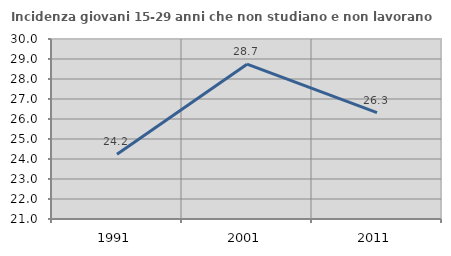
| Category | Incidenza giovani 15-29 anni che non studiano e non lavorano  |
|---|---|
| 1991.0 | 24.242 |
| 2001.0 | 28.74 |
| 2011.0 | 26.317 |